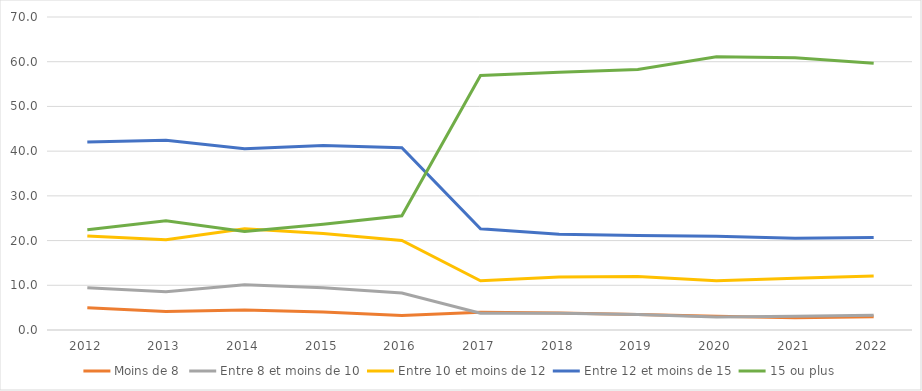
| Category | Moins de 8 | Entre 8 et moins de 10 | Entre 10 et moins de 12 | Entre 12 et moins de 15 | 15 ou plus |
|---|---|---|---|---|---|
| 2012.0 | 4.992 | 9.422 | 21.037 | 42.022 | 22.412 |
| 2013.0 | 4.112 | 8.566 | 20.168 | 42.447 | 24.407 |
| 2014.0 | 4.456 | 10.126 | 22.659 | 40.56 | 22.052 |
| 2015.0 | 4.038 | 9.43 | 21.588 | 41.285 | 23.659 |
| 2016.0 | 3.271 | 8.276 | 20.037 | 40.75 | 25.552 |
| 2017.0 | 3.978 | 3.733 | 11.011 | 22.646 | 56.941 |
| 2018.0 | 3.787 | 3.734 | 11.83 | 21.409 | 57.661 |
| 2019.0 | 3.441 | 3.473 | 11.991 | 21.12 | 58.258 |
| 2020.0 | 3.097 | 2.912 | 11.006 | 20.959 | 61.084 |
| 2021.0 | 2.736 | 3.058 | 11.55 | 20.532 | 60.891 |
| 2022.0 | 2.952 | 3.278 | 12.084 | 20.664 | 59.655 |